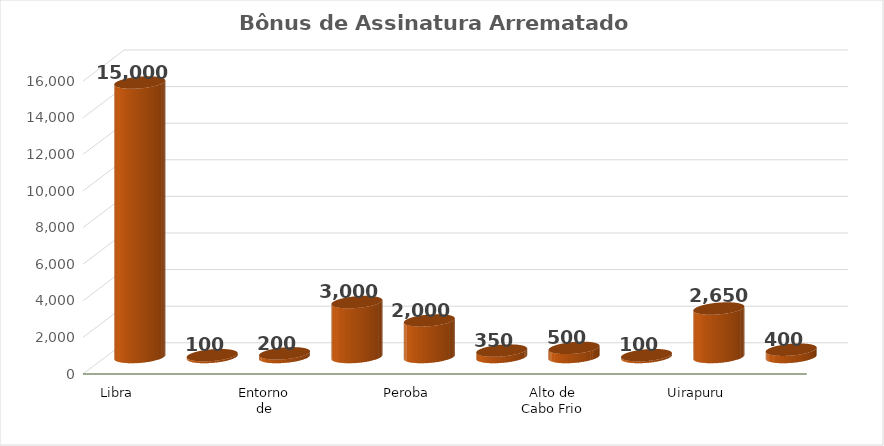
| Category | Bônus arrematado (milhões R$) |
|---|---|
| Libra | 15000 |
| Sul de Gato do Mato | 100 |
| Entorno de Sapinhoá | 200 |
| Norte de Carcará | 3000 |
| Peroba | 2000 |
| Alto de Cabo Frio - Oeste | 350 |
| Alto de Cabo Frio - Central | 500 |
| Três Marias | 100 |
| Uirapuru | 2650 |
| Dois Irmãos | 400 |